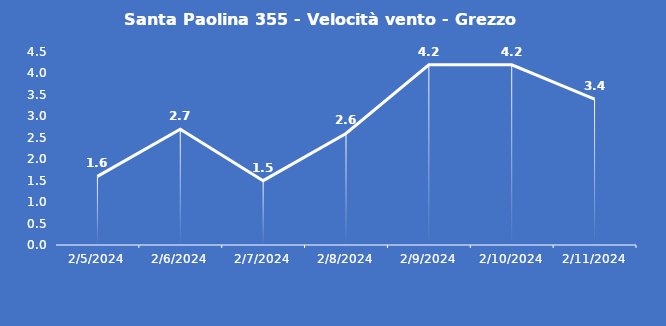
| Category | Santa Paolina 355 - Velocità vento - Grezzo (m/s) |
|---|---|
| 2/5/24 | 1.6 |
| 2/6/24 | 2.7 |
| 2/7/24 | 1.5 |
| 2/8/24 | 2.6 |
| 2/9/24 | 4.2 |
| 2/10/24 | 4.2 |
| 2/11/24 | 3.4 |